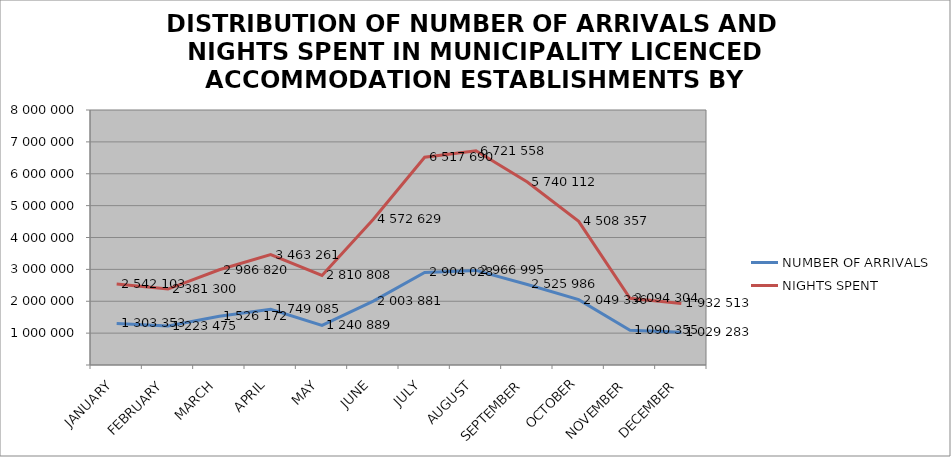
| Category | NUMBER OF ARRIVALS | NIGHTS SPENT |
|---|---|---|
| JANUARY | 1303353 | 2542103 |
| FEBRUARY | 1223475 | 2381300 |
| MARCH | 1526172 | 2986820 |
| APRIL | 1749085 | 3463261 |
| MAY | 1240889 | 2810808 |
| JUNE | 2003881 | 4572629 |
| JULY | 2904028 | 6517690 |
| AUGUST | 2966995 | 6721558 |
| SEPTEMBER | 2525986 | 5740112 |
| OCTOBER | 2049336 | 4508357 |
| NOVEMBER | 1090355 | 2094304 |
| DECEMBER | 1029283 | 1932513 |